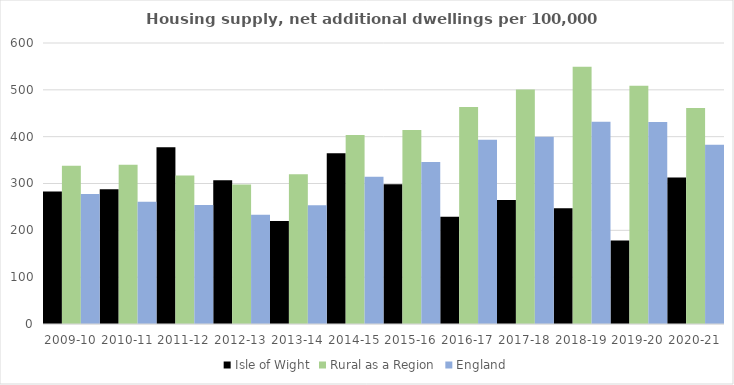
| Category | Isle of Wight | Rural as a Region | England |
|---|---|---|---|
| 2009-10 | 282.811 | 337.852 | 277.548 |
| 2010-11 | 287.864 | 340.105 | 260.994 |
| 2011-12 | 377.189 | 317.04 | 254.007 |
| 2012-13 | 306.859 | 297.763 | 233.153 |
| 2013-14 | 220.129 | 319.835 | 253.602 |
| 2014-15 | 364.597 | 403.796 | 314.256 |
| 2015-16 | 298.362 | 414.091 | 346.154 |
| 2016-17 | 228.854 | 463.209 | 393.256 |
| 2017-18 | 264.569 | 500.68 | 399.646 |
| 2018-19 | 247.283 | 549.491 | 432.099 |
| 2019-20 | 178.457 | 508.493 | 431.187 |
| 2020-21 | 312.728 | 461.114 | 382.827 |